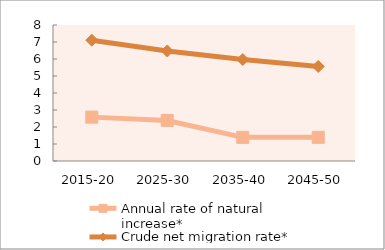
| Category | Annual rate of natural increase* | Crude net migration rate* |
|---|---|---|
| 2015-20 | 2.581 | 7.106 |
| 2025-30 | 2.386 | 6.471 |
| 2035-40 | 1.391 | 5.97 |
| 2045-50 | 1.393 | 5.561 |